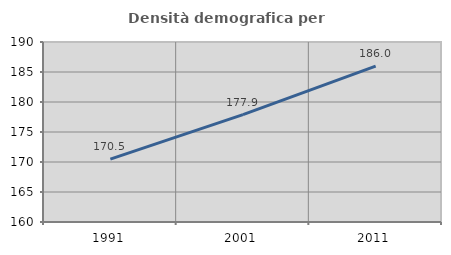
| Category | Densità demografica |
|---|---|
| 1991.0 | 170.49 |
| 2001.0 | 177.9 |
| 2011.0 | 185.97 |